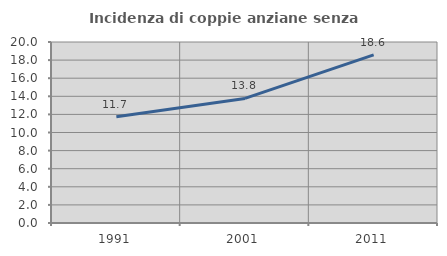
| Category | Incidenza di coppie anziane senza figli  |
|---|---|
| 1991.0 | 11.733 |
| 2001.0 | 13.768 |
| 2011.0 | 18.571 |